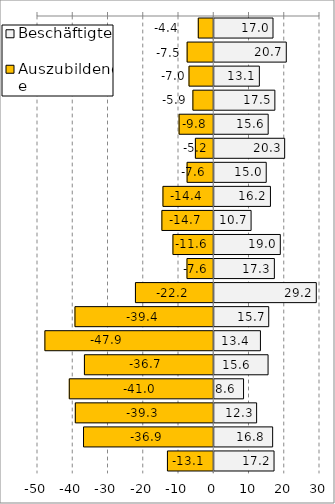
| Category | Beschäftigte | Auszubildende |
|---|---|---|
| 0 | 16.954 | -4.387 |
| 1 | 20.721 | -7.549 |
| 2 | 13.083 | -7.02 |
| 3 | 17.478 | -5.916 |
| 4 | 15.585 | -9.829 |
| 5 | 20.258 | -5.204 |
| 6 | 15.028 | -7.562 |
| 7 | 16.225 | -14.409 |
| 8 | 10.733 | -14.714 |
| 9 | 19.024 | -11.575 |
| 10 | 17.338 | -7.592 |
| 11 | 29.233 | -22.212 |
| 12 | 15.739 | -39.369 |
| 13 | 13.383 | -47.9 |
| 14 | 15.553 | -36.686 |
| 15 | 8.596 | -40.982 |
| 16 | 12.301 | -39.272 |
| 17 | 16.849 | -36.942 |
| 18 | 17.245 | -13.134 |